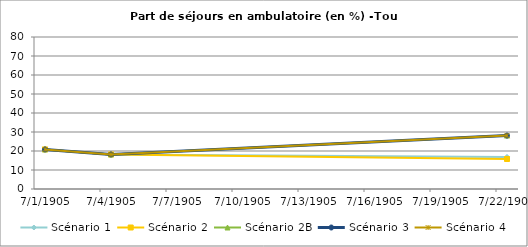
| Category | Scénario 1 | Scénario 2 | Scénario 2B | Scénario 3 | Scénario 4 |
|---|---|---|---|---|---|
| 2009.0 | 20.835 | 20.835 | 20.835 | 20.835 | 20.835 |
| 2012.0 | 18.186 | 18.186 | 18.186 | 18.186 | 18.186 |
| 2030.0 | 16.894 | 15.796 | 28.124 | 28.124 | 28.124 |